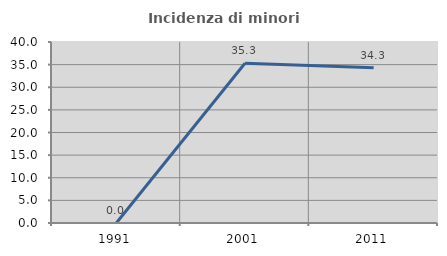
| Category | Incidenza di minori stranieri |
|---|---|
| 1991.0 | 0 |
| 2001.0 | 35.294 |
| 2011.0 | 34.286 |